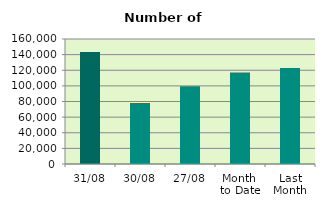
| Category | Series 0 |
|---|---|
| 31/08 | 143496 |
| 30/08 | 78010 |
| 27/08 | 99562 |
| Month 
to Date | 117090.273 |
| Last
Month | 122991 |